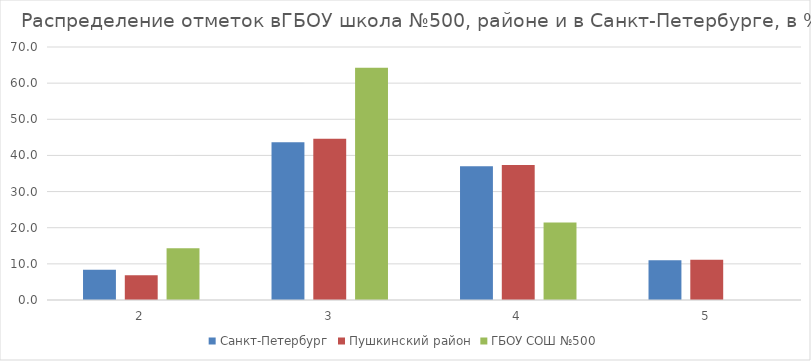
| Category | Санкт-Петербург | Пушкинский район | ГБОУ СОШ №500 |
|---|---|---|---|
| 2.0 | 8.35 | 6.85 | 14.29 |
| 3.0 | 43.64 | 44.62 | 64.29 |
| 4.0 | 36.99 | 37.37 | 21.43 |
| 5.0 | 11.02 | 11.16 | 0 |